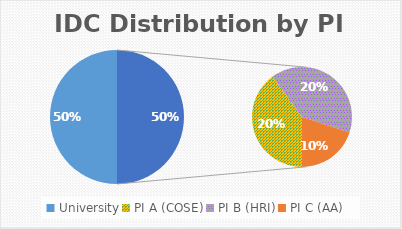
| Category | Series 0 |
|---|---|
| University | 0.5 |
| PI A (COSE) | 0.2 |
| PI B (HRI) | 0.2 |
| PI C (AA) | 0.1 |